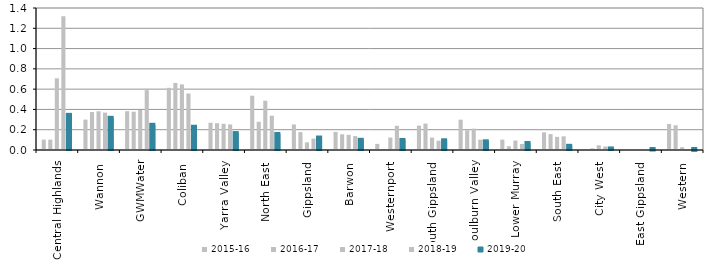
| Category | 2015-16 | 2016-17 | 2017-18 | 2018-19 | 2019-20 |
|---|---|---|---|---|---|
| Central Highlands  | 0.103 | 0.102 | 0.707 | 1.319 | 0.347 |
| Wannon  | 0.299 | 0.374 | 0.382 | 0.369 | 0.317 |
| GWMWater | 0.383 | 0.377 | 0.394 | 0.591 | 0.248 |
| Coliban  | 0.613 | 0.661 | 0.647 | 0.557 | 0.229 |
| Yarra Valley  | 0.268 | 0.264 | 0.258 | 0.252 | 0.167 |
| North East  | 0.535 | 0.278 | 0.486 | 0.338 | 0.158 |
| Gippsland  | 0.252 | 0.177 | 0.075 | 0.113 | 0.123 |
| Barwon  | 0.179 | 0.155 | 0.149 | 0.137 | 0.101 |
| Westernport  | 0.06 | 0 | 0.123 | 0.239 | 0.099 |
| South Gippsland  | 0.24 | 0.261 | 0.122 | 0.091 | 0.096 |
| Goulburn Valley  | 0.299 | 0.194 | 0.211 | 0.102 | 0.085 |
| Lower Murray  | 0.102 | 0.037 | 0.094 | 0.06 | 0.069 |
| South East  | 0.174 | 0.157 | 0.13 | 0.135 | 0.041 |
| City West  | 0 | 0.016 | 0.046 | 0.034 | 0.015 |
| East Gippsland  | 0 | 0 | 0 | 0 | 0.005 |
| Western  | 0.256 | 0.244 | 0.028 | 0 | 0.001 |